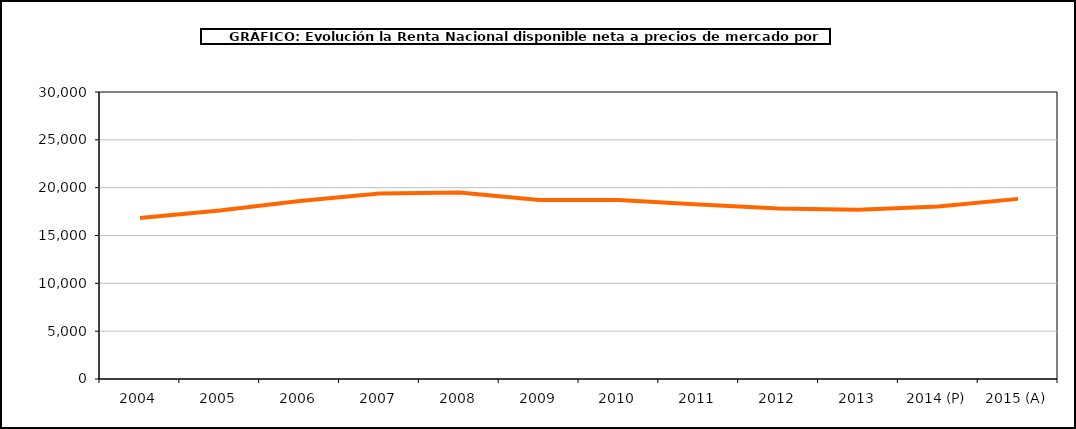
| Category | Renta por habitante |
|---|---|
| 2004 | 16821.604 |
| 2005 | 17616.696 |
| 2006 | 18603.095 |
| 2007 | 19401.051 |
| 2008 | 19491.849 |
| 2009 | 18719.406 |
| 2010 | 18706.369 |
| 2011 | 18228.845 |
| 2012 | 17821.601 |
| 2013 | 17691.091 |
| 2014 (P) | 18029.405 |
| 2015 (A) | 18828.323 |